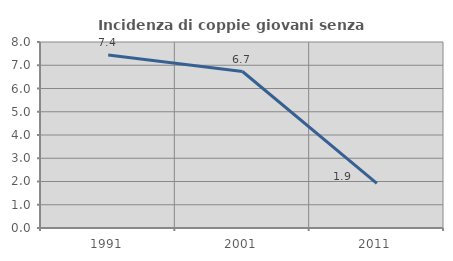
| Category | Incidenza di coppie giovani senza figli |
|---|---|
| 1991.0 | 7.438 |
| 2001.0 | 6.731 |
| 2011.0 | 1.923 |